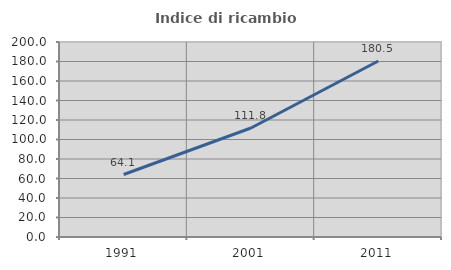
| Category | Indice di ricambio occupazionale  |
|---|---|
| 1991.0 | 64.092 |
| 2001.0 | 111.765 |
| 2011.0 | 180.511 |